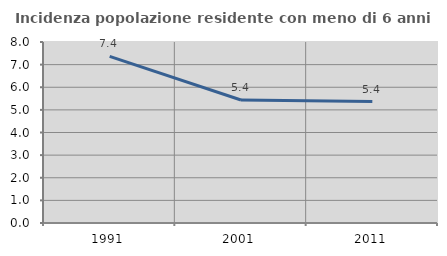
| Category | Incidenza popolazione residente con meno di 6 anni |
|---|---|
| 1991.0 | 7.364 |
| 2001.0 | 5.437 |
| 2011.0 | 5.369 |